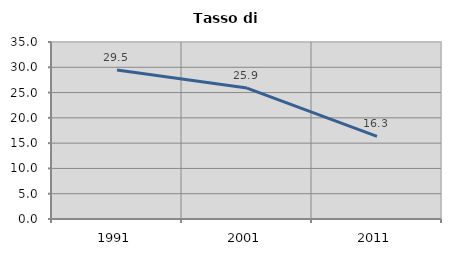
| Category | Tasso di disoccupazione   |
|---|---|
| 1991.0 | 29.482 |
| 2001.0 | 25.893 |
| 2011.0 | 16.333 |